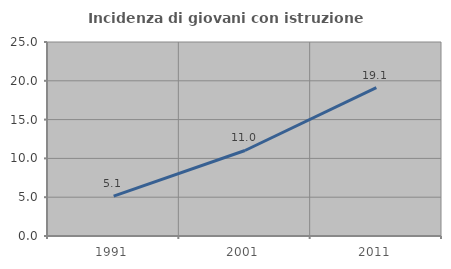
| Category | Incidenza di giovani con istruzione universitaria |
|---|---|
| 1991.0 | 5.128 |
| 2001.0 | 11.02 |
| 2011.0 | 19.118 |